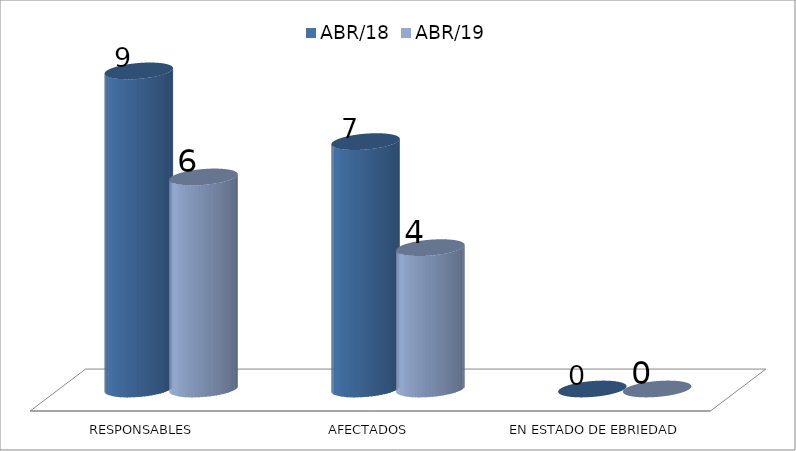
| Category | ABR/18 | ABR/19 |
|---|---|---|
| RESPONSABLES | 9 | 6 |
| AFECTADOS | 7 | 4 |
| EN ESTADO DE EBRIEDAD | 0 | 0 |